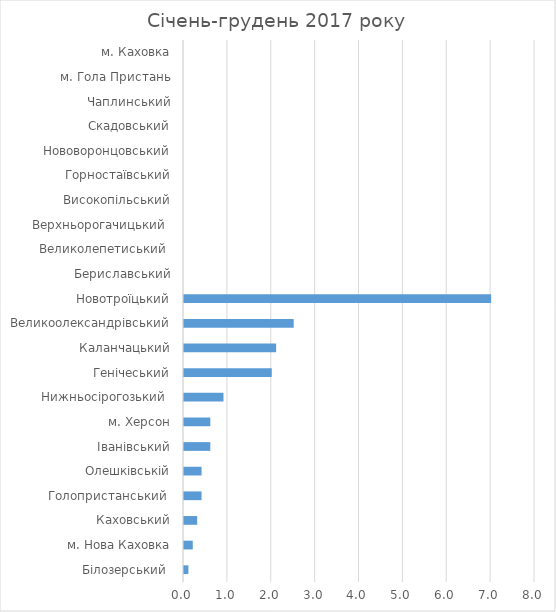
| Category | Series 0 |
|---|---|
| Білозерський  | 0.1 |
| м. Нова Каховка | 0.2 |
| Каховський | 0.3 |
| Голопристанський  | 0.4 |
| Олешківській | 0.4 |
| Іванівський | 0.6 |
| м. Херсон | 0.6 |
| Нижньосірогозький  | 0.9 |
| Генічеський | 2 |
| Каланчацький | 2.1 |
| Великоолександрівський | 2.5 |
| Новотроїцький | 7 |
| Бериславський | 0 |
| Великолепетиський  | 0 |
| Верхньорогачицький  | 0 |
| Високопільський | 0 |
| Горностаївський | 0 |
| Нововоронцовський | 0 |
| Скадовський | 0 |
| Чаплинський | 0 |
| м. Гола Пристань | 0 |
| м. Каховка | 0 |